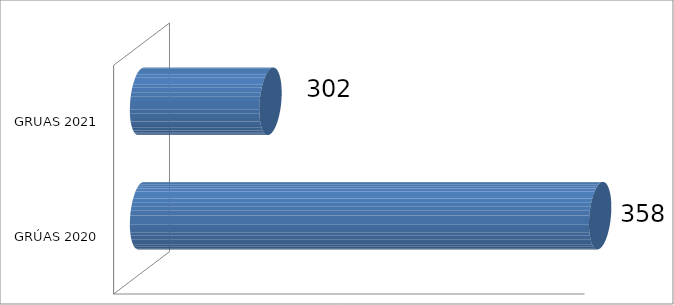
| Category | OCTUBRE |
|---|---|
| GRÚAS 2020 | 358 |
| GRUAS 2021 | 302 |